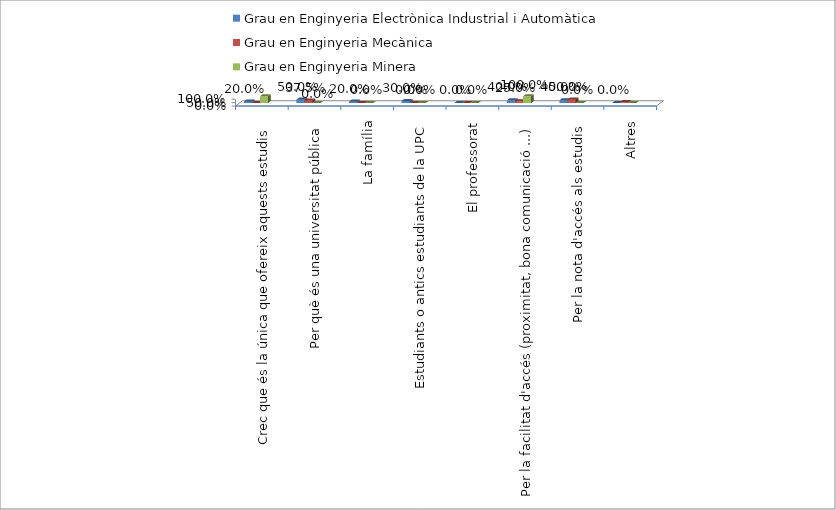
| Category | Grau en Enginyeria Electrònica Industrial i Automàtica | Grau en Enginyeria Mecànica | Grau en Enginyeria Minera | Series 3 | Series 4 |
|---|---|---|---|---|---|
| Crec que és la única que ofereix aquests estudis | 0.2 | 0 | 1 |  |  |
| Per què és una universitat pública | 0.5 | 0.375 | 0 |  |  |
| La família | 0.2 | 0 | 0 |  |  |
| Estudiants o antics estudiants de la UPC | 0.3 | 0 | 0 |  |  |
| El professorat | 0 | 0 | 0 |  |  |
| Per la facilitat d'accés (proximitat, bona comunicació ...) | 0.4 | 0.25 | 1 |  |  |
| Per la nota d'accés als estudis | 0.4 | 0.5 | 0 |  |  |
| Altres | 0 | 0.125 | 0 |  |  |